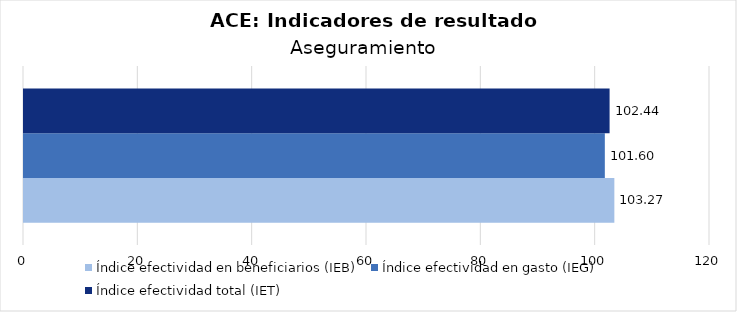
| Category | Índice efectividad en beneficiarios (IEB) | Índice efectividad en gasto (IEG)  | Índice efectividad total (IET) |
|---|---|---|---|
| Aseguramiento | 103.268 | 101.603 | 102.436 |